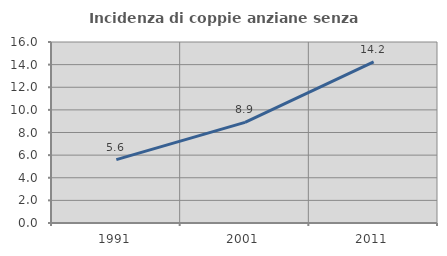
| Category | Incidenza di coppie anziane senza figli  |
|---|---|
| 1991.0 | 5.601 |
| 2001.0 | 8.892 |
| 2011.0 | 14.241 |